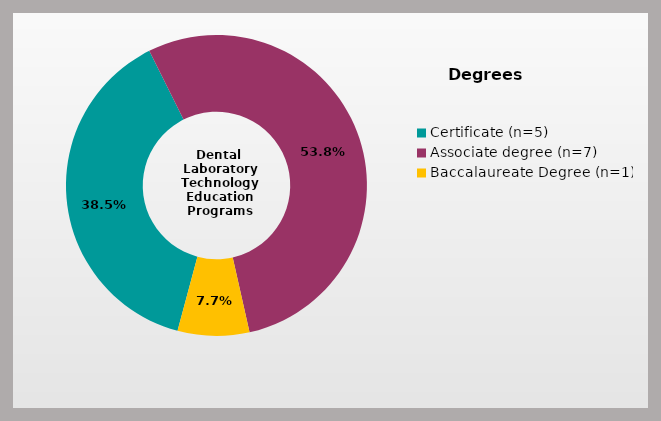
| Category | Series 0 |
|---|---|
| Certificate (n=5) | 0.385 |
| Associate degree (n=7) | 0.538 |
| Baccalaureate Degree (n=1) | 0.077 |